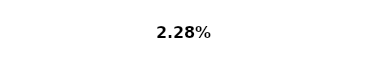
| Category | Series 0 |
|---|---|
| 0 | 0.023 |